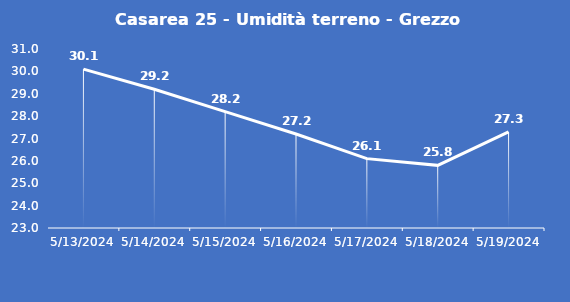
| Category | Casarea 25 - Umidità terreno - Grezzo (%VWC) |
|---|---|
| 5/13/24 | 30.1 |
| 5/14/24 | 29.2 |
| 5/15/24 | 28.2 |
| 5/16/24 | 27.2 |
| 5/17/24 | 26.1 |
| 5/18/24 | 25.8 |
| 5/19/24 | 27.3 |